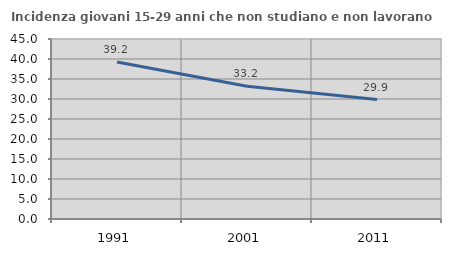
| Category | Incidenza giovani 15-29 anni che non studiano e non lavorano  |
|---|---|
| 1991.0 | 39.236 |
| 2001.0 | 33.21 |
| 2011.0 | 29.87 |